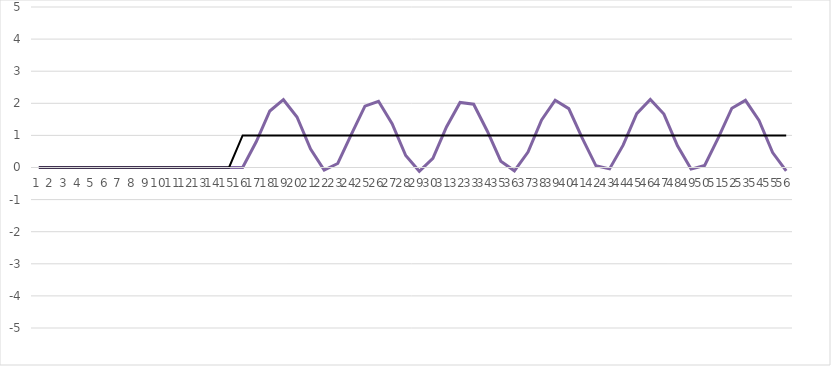
| Category | 4) | Series 5 |
|---|---|---|
| 0 | 0 | 0 |
| 1 | 0 | 0 |
| 2 | 0 | 0 |
| 3 | 0 | 0 |
| 4 | 0 | 0 |
| 5 | 0 | 0 |
| 6 | 0 | 0 |
| 7 | 0 | 0 |
| 8 | 0 | 0 |
| 9 | 0 | 0 |
| 10 | 0 | 0 |
| 11 | 0 | 0 |
| 12 | 0 | 0 |
| 13 | 0 | 0 |
| 14 | 0 | 0 |
| 15 | 0 | 1 |
| 16 | 0.8 | 1 |
| 17 | 1.76 | 1 |
| 18 | 2.112 | 1 |
| 19 | 1.574 | 1 |
| 20 | 0.577 | 1 |
| 21 | -0.082 | 1 |
| 22 | 0.125 | 1 |
| 23 | 1.031 | 1 |
| 24 | 1.913 | 1 |
| 25 | 2.064 | 1 |
| 26 | 1.364 | 1 |
| 27 | 0.373 | 1 |
| 28 | -0.117 | 1 |
| 29 | 0.287 | 1 |
| 30 | 1.261 | 1 |
| 31 | 2.026 | 1 |
| 32 | 1.97 | 1 |
| 33 | 1.138 | 1 |
| 34 | 0.195 | 1 |
| 35 | -0.104 | 1 |
| 36 | 0.48 | 1 |
| 37 | 1.48 | 1 |
| 38 | 2.096 | 1 |
| 39 | 1.835 | 1 |
| 40 | 0.906 | 1 |
| 41 | 0.052 | 1 |
| 42 | -0.043 | 1 |
| 43 | 0.696 | 1 |
| 44 | 1.678 | 1 |
| 45 | 2.118 | 1 |
| 46 | 1.663 | 1 |
| 47 | 0.678 | 1 |
| 48 | -0.05 | 1 |
| 49 | 0.062 | 1 |
| 50 | 0.924 | 1 |
| 51 | 1.847 | 1 |
| 52 | 2.092 | 1 |
| 53 | 1.463 | 1 |
| 54 | 0.464 | 1 |
| 55 | -0.107 | 1 |